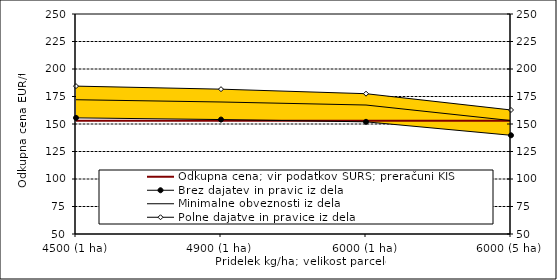
| Category | Odkupna cena; vir podatkov SURS; preračuni KIS |
|---|---|
| 4500 (1 ha) | 153 |
| 4900 (1 ha) | 153 |
| 6000 (1 ha) | 153 |
| 6000 (5 ha) | 153 |